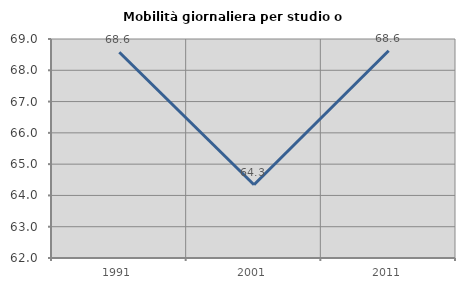
| Category | Mobilità giornaliera per studio o lavoro |
|---|---|
| 1991.0 | 68.578 |
| 2001.0 | 64.342 |
| 2011.0 | 68.626 |